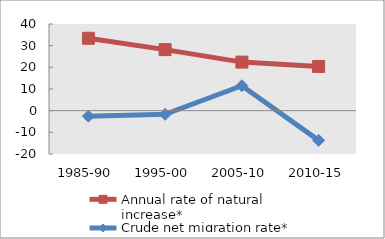
| Category | Annual rate of natural increase* | Crude net migration rate* |
|---|---|---|
| 1985-90 | 33.406 | -2.535 |
| 1995-00 | 28.174 | -1.693 |
| 2005-10 | 22.414 | 11.493 |
| 2010-15 | 20.388 | -13.699 |